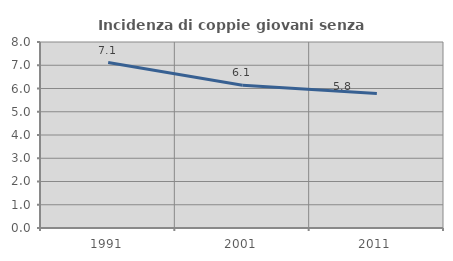
| Category | Incidenza di coppie giovani senza figli |
|---|---|
| 1991.0 | 7.115 |
| 2001.0 | 6.136 |
| 2011.0 | 5.786 |